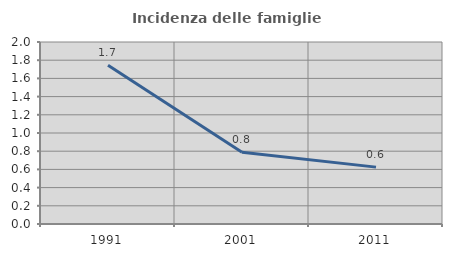
| Category | Incidenza delle famiglie numerose |
|---|---|
| 1991.0 | 1.745 |
| 2001.0 | 0.79 |
| 2011.0 | 0.625 |